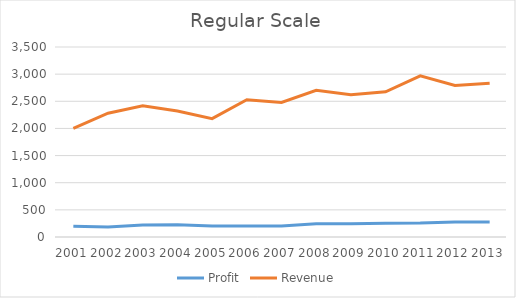
| Category | Profit | Revenue |
|---|---|---|
| 2001.0 | 200000 | 2000000 |
| 2002.0 | 186000 | 2280000 |
| 2003.0 | 219480 | 2416800 |
| 2004.0 | 223869.6 | 2320128 |
| 2005.0 | 203721.336 | 2180920.32 |
| 2006.0 | 201684.123 | 2529867.571 |
| 2007.0 | 203700.964 | 2479270.22 |
| 2008.0 | 244441.157 | 2702404.54 |
| 2009.0 | 241996.745 | 2621332.403 |
| 2010.0 | 254096.582 | 2673759.051 |
| 2011.0 | 256637.548 | 2967872.547 |
| 2012.0 | 277168.552 | 2789800.194 |
| 2013.0 | 275000 | 2830000 |